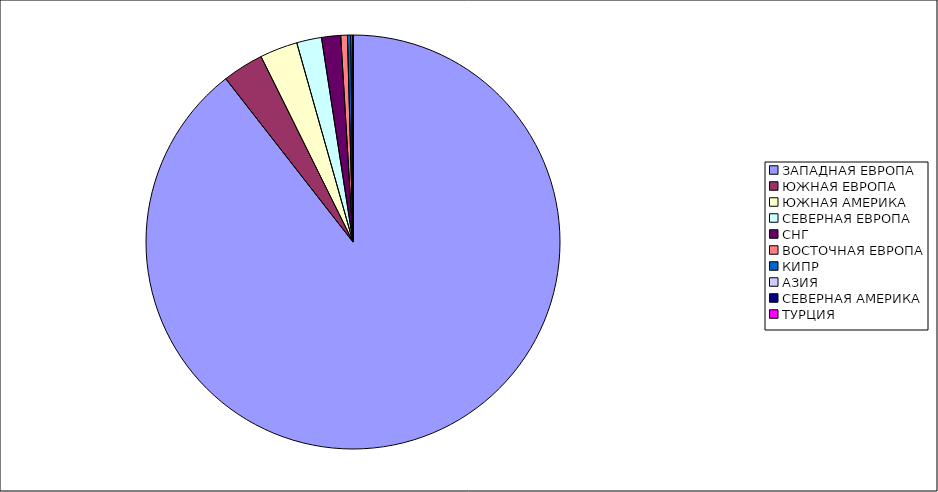
| Category | Оборот |
|---|---|
| ЗАПАДНАЯ ЕВРОПА | 0.895 |
| ЮЖНАЯ ЕВРОПА | 0.032 |
| ЮЖНАЯ АМЕРИКА | 0.029 |
| СЕВЕРНАЯ ЕВРОПА | 0.019 |
| СНГ | 0.015 |
| ВОСТОЧНАЯ ЕВРОПА | 0.005 |
| КИПР | 0.003 |
| АЗИЯ | 0.002 |
| СЕВЕРНАЯ АМЕРИКА | 0 |
| ТУРЦИЯ | 0 |